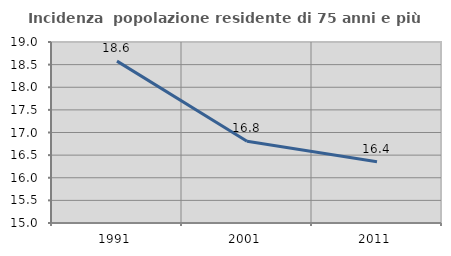
| Category | Incidenza  popolazione residente di 75 anni e più |
|---|---|
| 1991.0 | 18.577 |
| 2001.0 | 16.807 |
| 2011.0 | 16.355 |